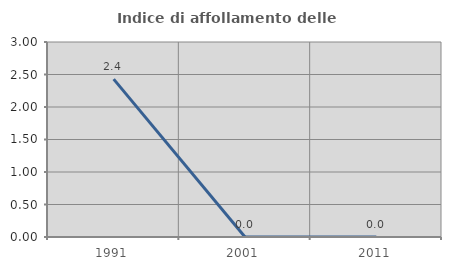
| Category | Indice di affollamento delle abitazioni  |
|---|---|
| 1991.0 | 2.429 |
| 2001.0 | 0 |
| 2011.0 | 0 |